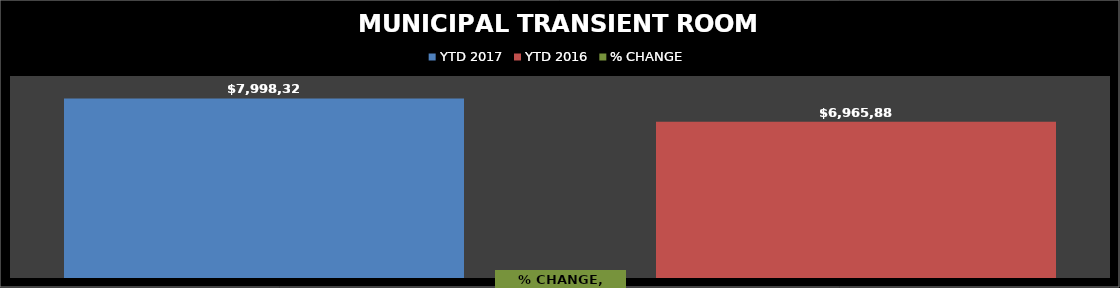
| Category | YTD 2017 | YTD 2016 |
|---|---|---|
| Restaurant Tax Distribution - 2017 | 7998326.59 | 6965889.12 |